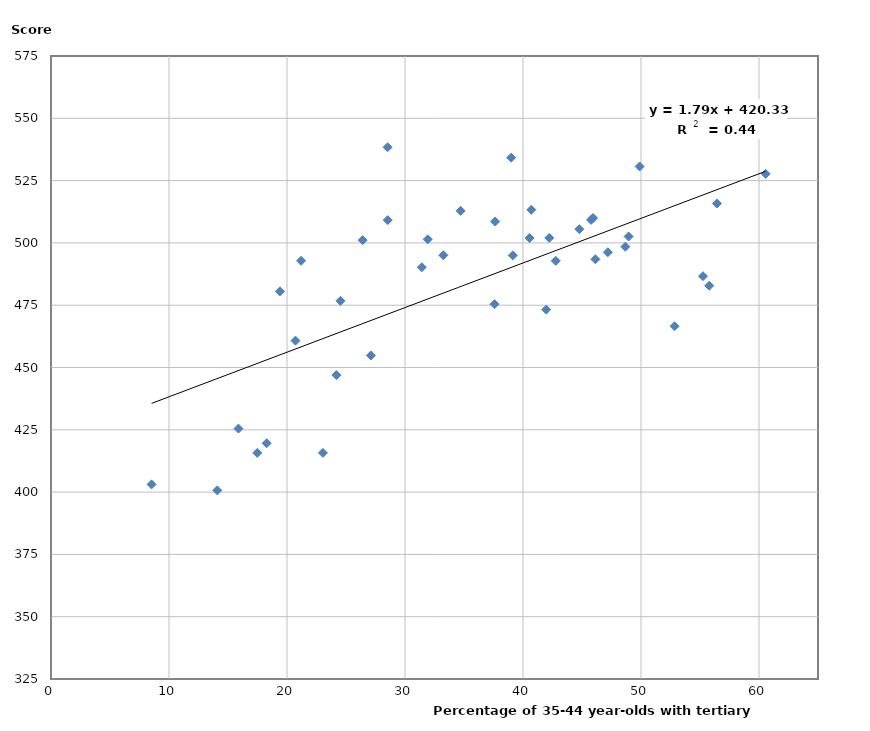
| Category | Parental education |
|---|---|
| nan | 427.225 |
| nan | 375.745 |
| 45.934661865234 | 509.994 |
| 33.248401641846 | 495.037 |
| 42.227722167969 | 502 |
| 14.093325614929 | 400.682 |
| nan | 517.779 |
| nan | 445.772 |
| nan | 475.187 |
| 60.563381195068 | 527.705 |
| 24.184377670288 | 446.956 |
| nan | 532.347 |
| 23.042791366577 | 415.729 |
| 18.279001235962 | 419.608 |
| nan | 475.391 |
| nan | 432.596 |
| 21.191297531128 | 492.83 |
| 40.550636291504 | 501.937 |
| nan | 331.639 |
| 39.0 | 534.194 |
| 49.885917663574 | 530.661 |
| 39.137092590332 | 494.978 |
| nan | 383.682 |
| nan | 411.132 |
| 28.536714553833 | 509.141 |
| 27.108419418335 | 454.829 |
| nan | 523.277 |
| 24.528160095215 | 476.748 |
| 41.965644836426 | 473.23 |
| 8.524676322937 | 403.1 |
| 48.950801849365 | 502.575 |
| 52.842079162598 | 466.553 |
| 19.401660919189 | 480.547 |
| 28.524045944214 | 538.395 |
| nan | 408.669 |
| 56.432941436768 | 515.81 |
| nan | 378.442 |
| 31.425584793091 | 490.225 |
| nan | 386.485 |
| 37.585262298584 | 475.409 |
| 55.783779144287 | 482.806 |
| nan | 528.55 |
| nan | 464.782 |
| 17.480096817017 | 415.71 |
| nan | 427.998 |
| nan | 411.314 |
| 37.640823364258 | 508.575 |
| 40.704906463623 | 513.304 |
| 48.673553466797 | 498.481 |
| nan | 396.684 |
| 31.92373085022 | 501.435 |
| 26.410331726074 | 501.1 |
| nan | 417.611 |
| nan | 434.885 |
| 55.251419067383 | 486.631 |
| nan | 555.575 |
| 20.718986511231 | 460.775 |
| 34.712181091309 | 512.864 |
| 42.779151916504 | 492.786 |
| 46.132904052734 | 493.422 |
| 44.77649307251 | 505.506 |
| nan | 421.337 |
| nan | 424.59 |
| nan | 386.403 |
| 15.885540008545 | 425.49 |
| nan | 436.731 |
| 45.767852783203 | 509.222 |
| 47.192680358887 | 496.242 |
| nan | 435.363 |
| nan | 524.645 |